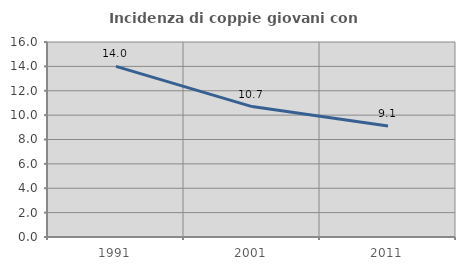
| Category | Incidenza di coppie giovani con figli |
|---|---|
| 1991.0 | 14.004 |
| 2001.0 | 10.701 |
| 2011.0 | 9.106 |